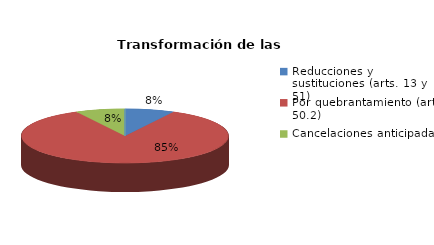
| Category | Series 0 |
|---|---|
| Reducciones y sustituciones (arts. 13 y 51) | 1 |
| Por quebrantamiento (art. 50.2) | 11 |
| Cancelaciones anticipadas | 1 |
| Traslado a Centros Penitenciarios | 0 |
| Conversión internamientos en cerrados (art. 51.2) | 0 |